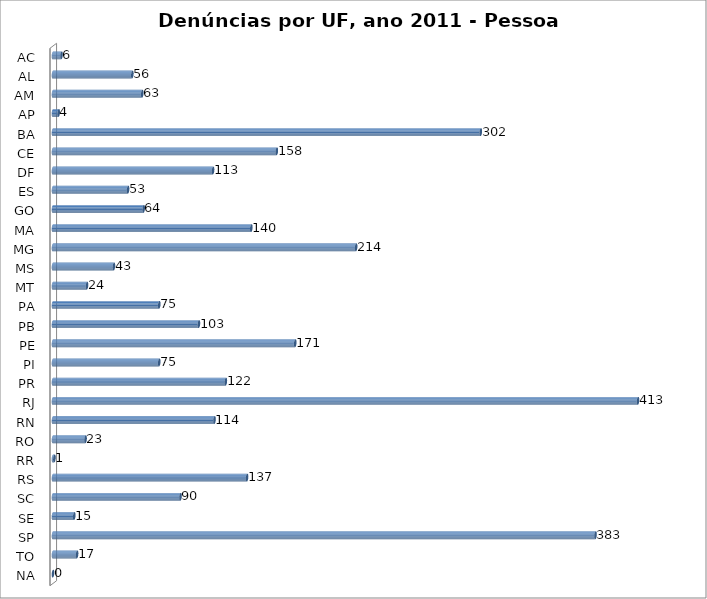
| Category | Series 0 |
|---|---|
| AC | 6 |
| AL | 56 |
| AM | 63 |
| AP | 4 |
| BA | 302 |
| CE | 158 |
| DF | 113 |
| ES | 53 |
| GO | 64 |
| MA | 140 |
| MG | 214 |
| MS | 43 |
| MT | 24 |
| PA | 75 |
| PB | 103 |
| PE | 171 |
| PI | 75 |
| PR | 122 |
| RJ | 413 |
| RN | 114 |
| RO | 23 |
| RR | 1 |
| RS | 137 |
| SC | 90 |
| SE | 15 |
| SP | 383 |
| TO | 17 |
| NA | 0 |